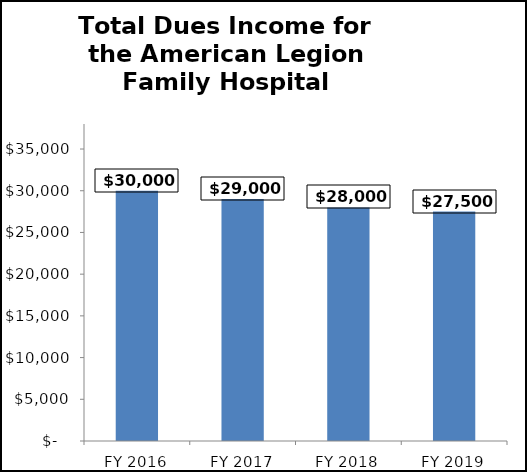
| Category | Series 0 |
|---|---|
| FY 2016 | 30000 |
| FY 2017 | 29000 |
| FY 2018 | 28000 |
| FY 2019 | 27500 |